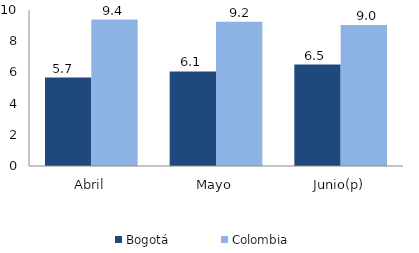
| Category | Bogotá | Colombia |
|---|---|---|
| Abril | 5.672 | 9.385 |
| Mayo | 6.064 | 9.245 |
| Junio(p) | 6.501 | 9.043 |